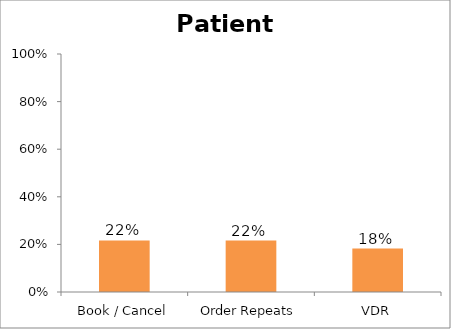
| Category | LONG FURLONG MEDICAL CENTRE |
|---|---|
| Book / Cancel | 0.217 |
| Order Repeats | 0.216 |
| VDR | 0.182 |